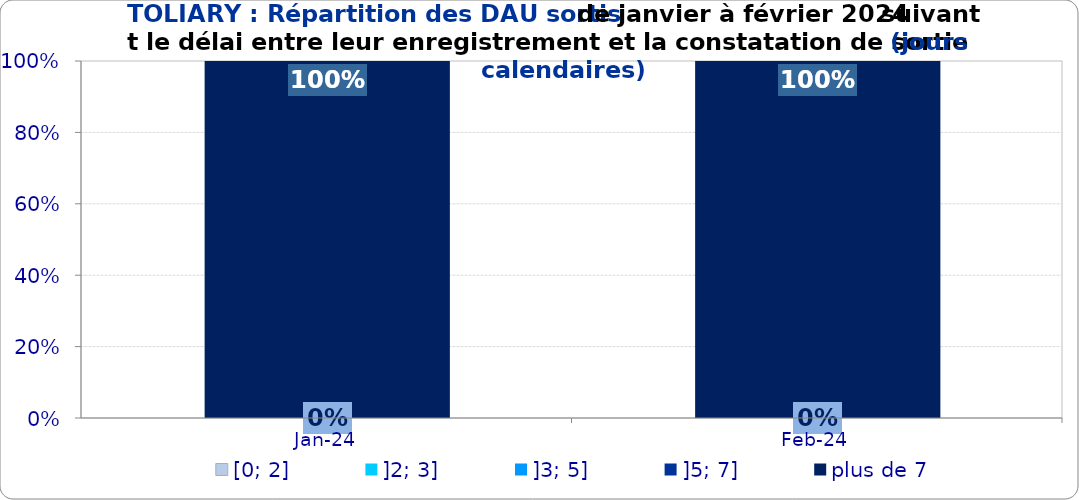
| Category | [0; 2] | ]2; 3] | ]3; 5] | ]5; 7] | plus de 7 |
|---|---|---|---|---|---|
| 2024-01-01 | 0 | 0 | 0 | 0 | 1 |
| 2024-02-01 | 0 | 0 | 0 | 0 | 1 |